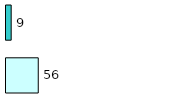
| Category | Series 0 | Series 1 |
|---|---|---|
| 0 | 56 | 9 |